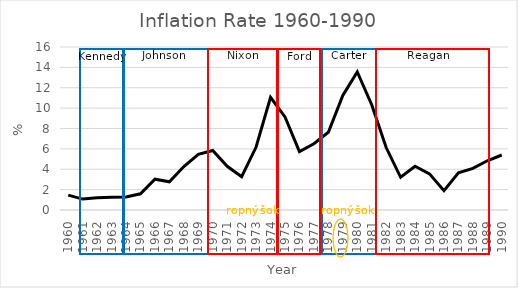
| Category | Series 0 |
|---|---|
| 1960.0 | 1.46 |
| 1961.0 | 1.07 |
| 1962.0 | 1.2 |
| 1963.0 | 1.24 |
| 1964.0 | 1.28 |
| 1965.0 | 1.59 |
| 1966.0 | 3.02 |
| 1967.0 | 2.77 |
| 1968.0 | 4.27 |
| 1969.0 | 5.46 |
| 1970.0 | 5.84 |
| 1971.0 | 4.29 |
| 1972.0 | 3.27 |
| 1973.0 | 6.18 |
| 1974.0 | 11.05 |
| 1975.0 | 9.14 |
| 1976.0 | 5.74 |
| 1977.0 | 6.5 |
| 1978.0 | 7.63 |
| 1979.0 | 11.25 |
| 1980.0 | 13.55 |
| 1981.0 | 10.33 |
| 1982.0 | 6.13 |
| 1983.0 | 3.21 |
| 1984.0 | 4.3 |
| 1985.0 | 3.55 |
| 1986.0 | 1.9 |
| 1987.0 | 3.66 |
| 1988.0 | 4.08 |
| 1989.0 | 4.83 |
| 1990.0 | 5.4 |